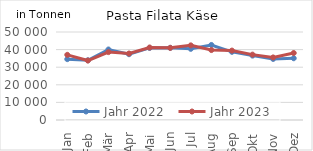
| Category | Jahr 2022 | Jahr 2023 |
|---|---|---|
| Jan | 34576.92 | 37030.173 |
| Feb | 33932.541 | 33774.169 |
| Mär | 40064.9 | 38567.326 |
| Apr | 37375.669 | 37766.473 |
| Mai | 40951.625 | 41197.43 |
| Jun | 41015.75 | 40987.378 |
| Jul | 40438.794 | 42409.201 |
| Aug | 42631.834 | 39738.161 |
| Sep | 38737.334 | 39440.709 |
| Okt | 36593.363 | 37145.651 |
| Nov | 34694.623 | 35549.966 |
| Dez | 35085.663 | 38064.317 |